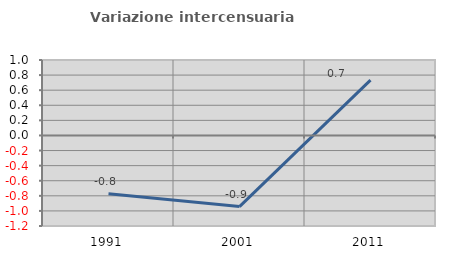
| Category | Variazione intercensuaria annua |
|---|---|
| 1991.0 | -0.773 |
| 2001.0 | -0.943 |
| 2011.0 | 0.734 |